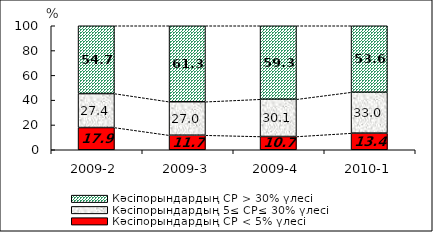
| Category | Кәсіпорындардың СР < 5% үлесі | Кәсіпорындардың 5≤ СР≤ 30% үлесі | Кәсіпорындардың СР > 30% үлесі |
|---|---|---|---|
| 2009-2 | 17.928 | 27.377 | 54.695 |
| 2009-3 | 11.736 | 27.006 | 61.258 |
| 2009-4 | 10.696 | 30.051 | 59.253 |
| 2010-1 | 13.413 | 33.016 | 53.571 |